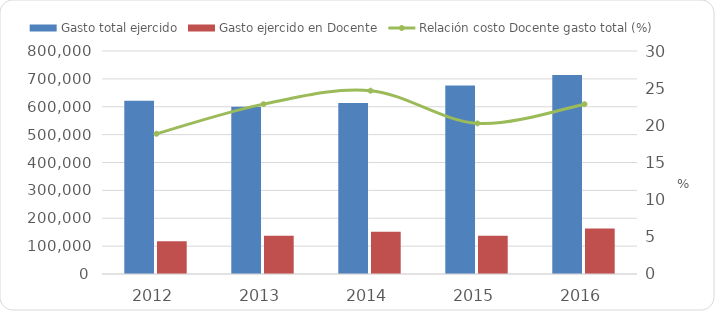
| Category | Gasto total ejercido | Gasto ejercido en Docente |
|---|---|---|
| 2012 | 621909.5 | 117330.865 |
| 2013 | 600163.1 | 137147.673 |
| 2014 | 613052.1 | 151173.245 |
| 2015 | 676403.338 | 137024.068 |
| 2016 | 713725.8 | 163056.983 |